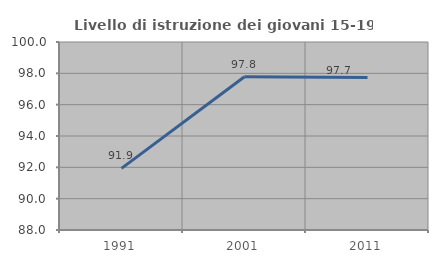
| Category | Livello di istruzione dei giovani 15-19 anni |
|---|---|
| 1991.0 | 91.935 |
| 2001.0 | 97.778 |
| 2011.0 | 97.727 |